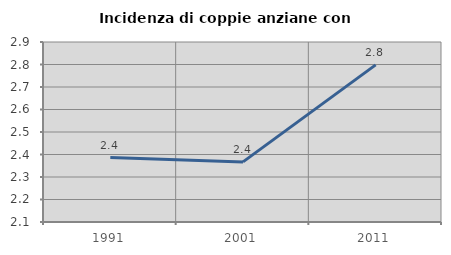
| Category | Incidenza di coppie anziane con figli |
|---|---|
| 1991.0 | 2.386 |
| 2001.0 | 2.367 |
| 2011.0 | 2.798 |